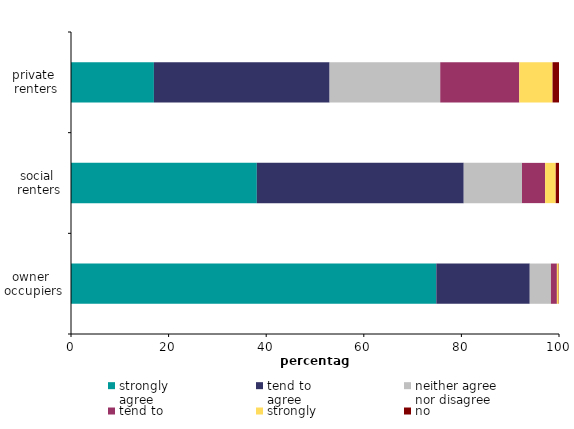
| Category | strongly 
agree | tend to 
agree | neither agree 
nor disagree | tend to 
disagree | strongly 
disagree  | no 
opinion |
|---|---|---|---|---|---|---|
| owner 
occupiers | 74.857 | 19.151 | 4.337 | 1.223 | 0.375 | 0.057 |
| social 
renters | 38.08 | 42.399 | 11.941 | 4.734 | 2.179 | 0.667 |
| private 
renters | 16.988 | 36.003 | 22.67 | 16.194 | 6.825 | 1.32 |